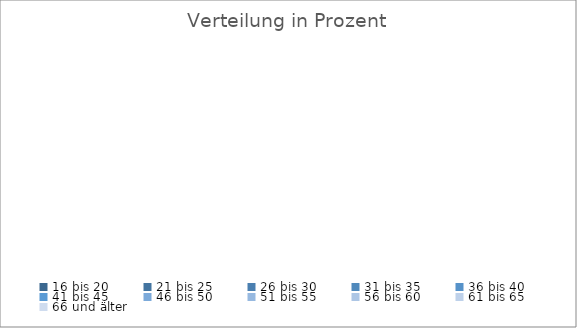
| Category | Anteil in % |
|---|---|
| 16 bis 20 | 0 |
| 21 bis 25 | 0 |
| 26 bis 30 | 0 |
| 31 bis 35 | 0 |
| 36 bis 40 | 0 |
| 41 bis 45 | 0 |
| 46 bis 50 | 0 |
| 51 bis 55 | 0 |
| 56 bis 60 | 0 |
| 61 bis 65 | 0 |
| 66 und älter | 0 |